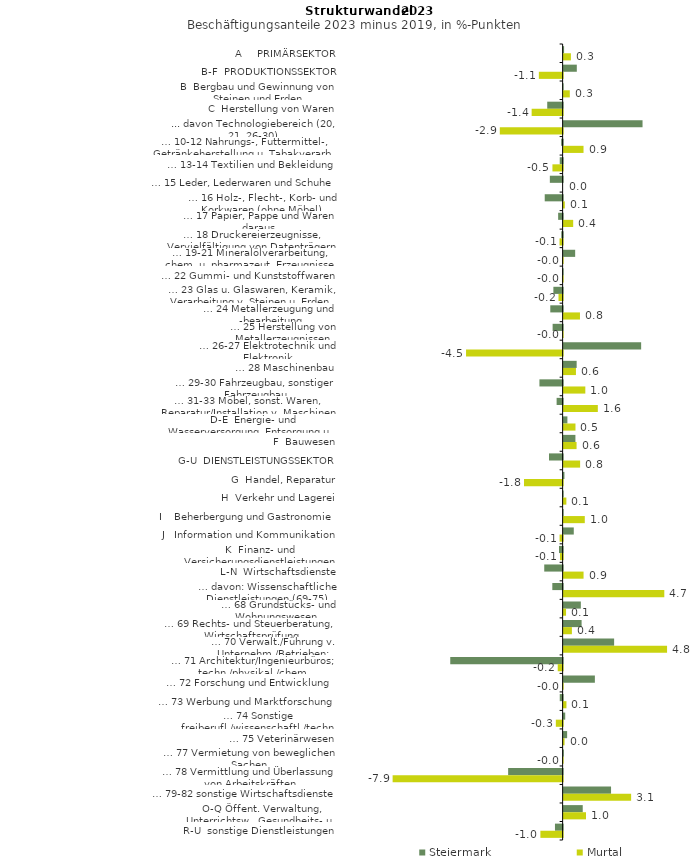
| Category | Steiermark | Murtal |
|---|---|---|
| A     PRIMÄRSEKTOR | 0.022 | 0.338 |
| B-F  PRODUKTIONSSEKTOR | 0.612 | -1.103 |
| B  Bergbau und Gewinnung von Steinen und Erden | -0.009 | 0.286 |
| C  Herstellung von Waren | -0.714 | -1.437 |
| ... davon Technologiebereich (20, 21, 26-30) | 3.66 | -2.913 |
| … 10-12 Nahrungs-, Futtermittel-, Getränkeherstellung u. Tabakverarb. | -0.068 | 0.923 |
| … 13-14 Textilien und Bekleidung | -0.134 | -0.472 |
| … 15 Leder, Lederwaren und Schuhe | -0.593 | 0 |
| … 16 Holz-, Flecht-, Korb- und Korkwaren (ohne Möbel)  | -0.83 | 0.054 |
| … 17 Papier, Pappe und Waren daraus  | -0.208 | 0.444 |
| … 18 Druckereierzeugnisse, Vervielfältigung von Datenträgern | -0.063 | -0.143 |
| … 19-21 Mineralölverarbeitung, chem. u. pharmazeut. Erzeugnisse | 0.535 | -0.027 |
| … 22 Gummi- und Kunststoffwaren | -0.02 | -0.031 |
| … 23 Glas u. Glaswaren, Keramik, Verarbeitung v. Steinen u. Erden  | -0.429 | -0.191 |
| … 24 Metallerzeugung und -bearbeitung | -0.572 | 0.758 |
| … 25 Herstellung von Metallerzeugnissen  | -0.464 | -0.014 |
| … 26-27 Elektrotechnik und Elektronik | 3.595 | -4.479 |
| … 28 Maschinenbau | 0.604 | 0.572 |
| … 29-30 Fahrzeugbau, sonstiger Fahrzeugbau | -1.076 | 1.006 |
| … 31-33 Möbel, sonst. Waren, Reparatur/Installation v. Maschinen | -0.279 | 1.586 |
| D-E  Energie- und Wasserversorgung, Entsorgung u. Rückgewinnung | 0.175 | 0.55 |
| F  Bauwesen | 0.547 | 0.601 |
| G-U  DIENSTLEISTUNGSSEKTOR | -0.633 | 0.765 |
| G  Handel, Reparatur | 0.038 | -1.791 |
| H  Verkehr und Lagerei | -0.011 | 0.127 |
| I    Beherbergung und Gastronomie | -0.007 | 0.982 |
| J   Information und Kommunikation | 0.471 | -0.142 |
| K  Finanz- und Versicherungsdienstleistungen | -0.168 | -0.123 |
| L-N  Wirtschaftsdienste | -0.853 | 0.924 |
| … davon: Wissenschaftliche Dienstleistungen (69-75) | -0.478 | 4.669 |
| … 68 Grundstücks- und Wohnungswesen  | 0.798 | 0.112 |
| … 69 Rechts- und Steuerberatung, Wirtschaftsprüfung | 0.834 | 0.384 |
| … 70 Verwalt./Führung v. Unternehm./Betrieben; Unternehmensberat. | 2.342 | 4.797 |
| … 71 Architektur/Ingenieurbüros; techn./physikal./chem. Untersuchung | -5.212 | -0.227 |
| … 72 Forschung und Entwicklung  | 1.449 | -0.015 |
| … 73 Werbung und Marktforschung | -0.133 | 0.131 |
| … 74 Sonstige freiberufl./wissenschaftl./techn. Tätigkeiten | 0.074 | -0.315 |
| … 75 Veterinärwesen | 0.163 | 0.043 |
| … 77 Vermietung von beweglichen Sachen  | 0.011 | -0.027 |
| … 78 Vermittlung und Überlassung von Arbeitskräften | -2.527 | -7.884 |
| … 79-82 sonstige Wirtschaftsdienste | 2.199 | 3.13 |
| O-Q Öffent. Verwaltung, Unterrichtsw., Gesundheits- u. Sozialwesen | 0.886 | 1.038 |
| R-U  sonstige Dienstleistungen | -0.355 | -1.031 |